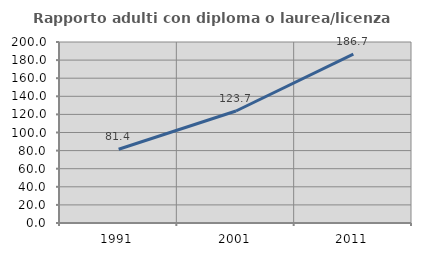
| Category | Rapporto adulti con diploma o laurea/licenza media  |
|---|---|
| 1991.0 | 81.44 |
| 2001.0 | 123.746 |
| 2011.0 | 186.7 |